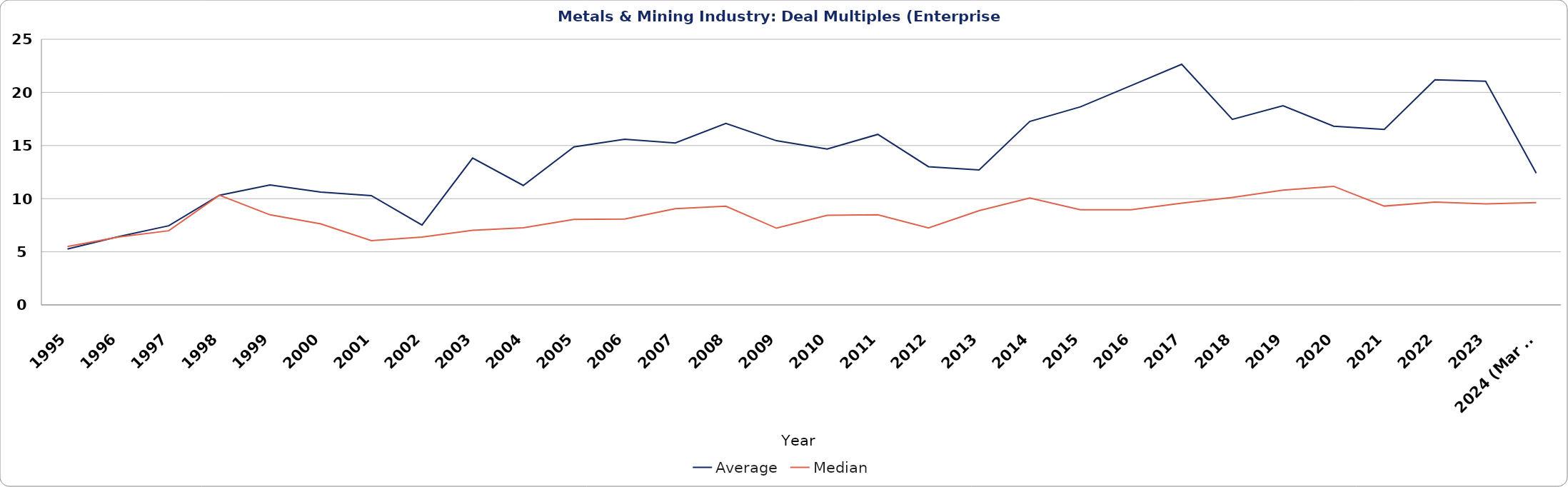
| Category | Average | Median |
|---|---|---|
| 1995 | 5.26 | 5.5 |
| 1996 | 6.42 | 6.38 |
| 1997 | 7.45 | 6.98 |
| 1998 | 10.32 | 10.32 |
| 1999 | 11.29 | 8.48 |
| 2000 | 10.62 | 7.63 |
| 2001 | 10.29 | 6.05 |
| 2002 | 7.52 | 6.38 |
| 2003 | 13.82 | 7.02 |
| 2004 | 11.24 | 7.26 |
| 2005 | 14.87 | 8.05 |
| 2006 | 15.59 | 8.08 |
| 2007 | 15.24 | 9.05 |
| 2008 | 17.09 | 9.29 |
| 2009 | 15.45 | 7.22 |
| 2010 | 14.67 | 8.43 |
| 2011 | 16.05 | 8.49 |
| 2012 | 13.01 | 7.24 |
| 2013 | 12.7 | 8.87 |
| 2014 | 17.27 | 10.06 |
| 2015 | 18.64 | 8.96 |
| 2016 | 20.64 | 8.95 |
| 2017 | 22.65 | 9.58 |
| 2018 | 17.46 | 10.11 |
| 2019 | 18.74 | 10.8 |
| 2020 | 16.82 | 11.16 |
| 2021 | 16.51 | 9.3 |
| 2022 | 21.19 | 9.68 |
| 2023 | 21.05 | 9.51 |
| 2024 (Mar 31) | 12.4 | 9.62 |